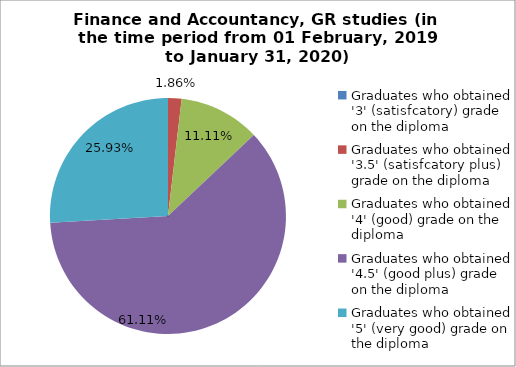
| Category | Series 0 |
|---|---|
| Graduates who obtained '3' (satisfcatory) grade on the diploma | 0 |
| Graduates who obtained '3.5' (satisfcatory plus) grade on the diploma | 1.852 |
| Graduates who obtained '4' (good) grade on the diploma | 11.111 |
| Graduates who obtained '4.5' (good plus) grade on the diploma | 61.111 |
| Graduates who obtained '5' (very good) grade on the diploma | 25.926 |